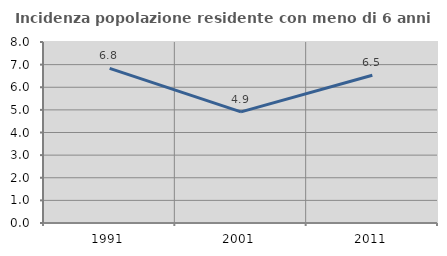
| Category | Incidenza popolazione residente con meno di 6 anni |
|---|---|
| 1991.0 | 6.835 |
| 2001.0 | 4.91 |
| 2011.0 | 6.527 |